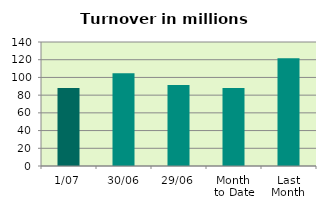
| Category | Series 0 |
|---|---|
| 1/07 | 88.131 |
| 30/06 | 104.737 |
| 29/06 | 91.37 |
| Month 
to Date | 88.131 |
| Last
Month | 121.74 |